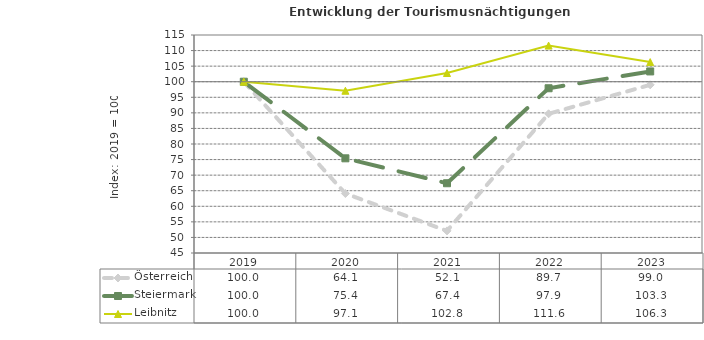
| Category | Österreich | Steiermark | Leibnitz |
|---|---|---|---|
| 2023.0 | 99 | 103.3 | 106.3 |
| 2022.0 | 89.7 | 97.9 | 111.6 |
| 2021.0 | 52.1 | 67.4 | 102.8 |
| 2020.0 | 64.1 | 75.4 | 97.1 |
| 2019.0 | 100 | 100 | 100 |